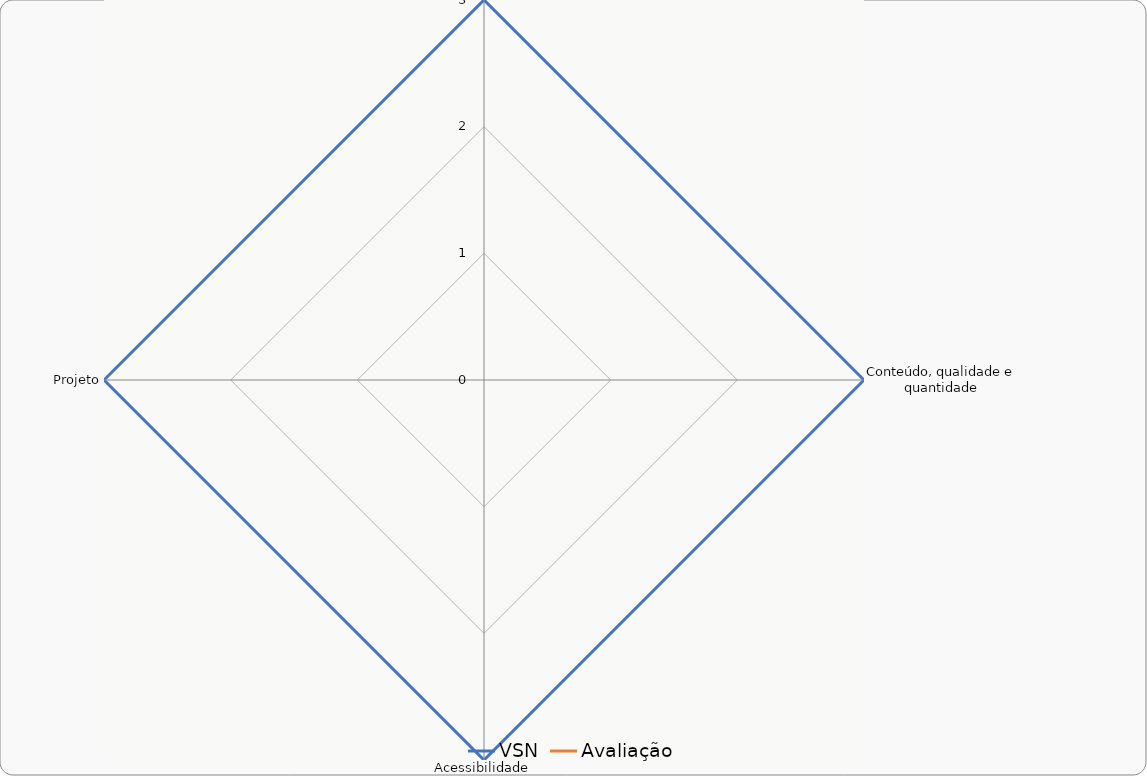
| Category | VSN | Avaliação |
|---|---|---|
| Credibilidade | 3 | 0 |
| Conteúdo, qualidade e quantidade | 3 | 0 |
| Acessibilidade | 3 | 0 |
| Projeto | 3 | 0 |